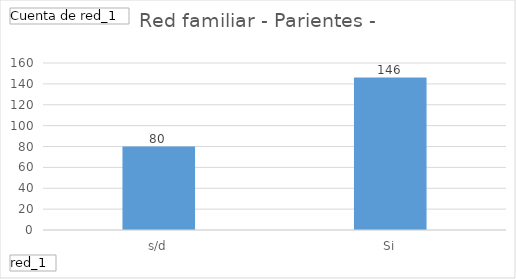
| Category | Total |
|---|---|
| s/d | 80 |
| Si | 146 |